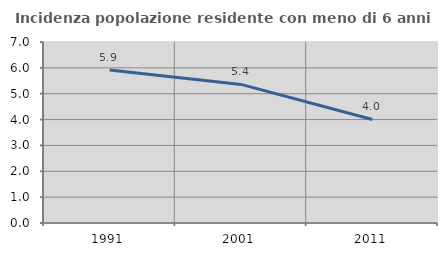
| Category | Incidenza popolazione residente con meno di 6 anni |
|---|---|
| 1991.0 | 5.918 |
| 2001.0 | 5.361 |
| 2011.0 | 4.003 |